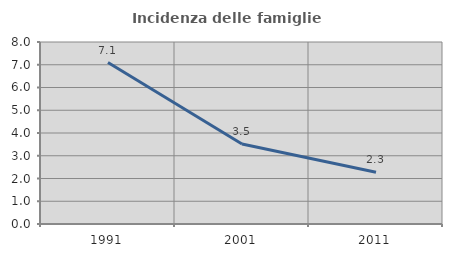
| Category | Incidenza delle famiglie numerose |
|---|---|
| 1991.0 | 7.098 |
| 2001.0 | 3.518 |
| 2011.0 | 2.273 |